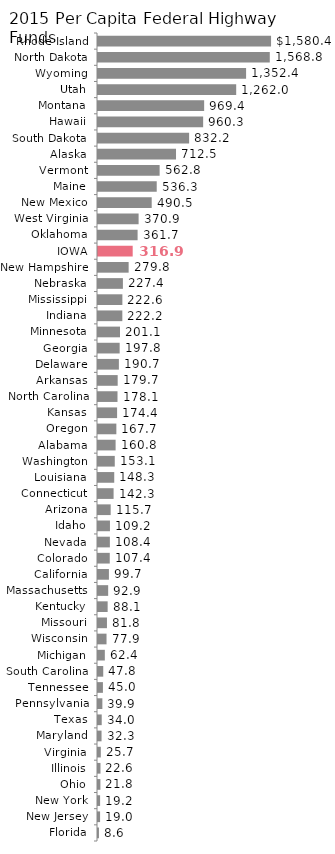
| Category | Per Capita |
|---|---|
| Florida | 8.585 |
| New Jersey | 19.037 |
| New York | 19.2 |
| Ohio | 21.822 |
| Illinois | 22.595 |
| Virginia | 25.652 |
| Maryland | 32.35 |
| Texas | 33.953 |
| Pennsylvania | 39.887 |
| Tennessee | 45.002 |
| South Carolina | 47.848 |
| Michigan | 62.377 |
| Wisconsin | 77.917 |
| Missouri | 81.818 |
| Kentucky | 88.123 |
| Massachusetts | 92.864 |
| California | 99.716 |
| Colorado | 107.439 |
| Nevada | 108.449 |
| Idaho | 109.231 |
| Arizona | 115.746 |
| Connecticut | 142.337 |
| Louisiana | 148.269 |
| Washington | 153.106 |
| Alabama | 160.802 |
| Oregon | 167.658 |
| Kansas | 174.37 |
| North Carolina | 178.111 |
| Arkansas | 179.713 |
| Delaware | 190.709 |
| Georgia | 197.835 |
| Minnesota | 201.112 |
| Indiana | 222.202 |
| Mississippi | 222.647 |
| Nebraska | 227.44 |
| New Hampshire | 279.778 |
|    IOWA | 316.864 |
| Oklahoma | 361.662 |
| West Virginia | 370.863 |
| New Mexico | 490.468 |
| Maine | 536.348 |
| Vermont | 562.847 |
| Alaska | 712.49 |
| South Dakota | 832.202 |
| Hawaii | 960.255 |
| Montana | 969.412 |
| Utah | 1262.047 |
| Wyoming | 1352.386 |
| North Dakota | 1568.814 |
| Rhode Island | 1580.412 |